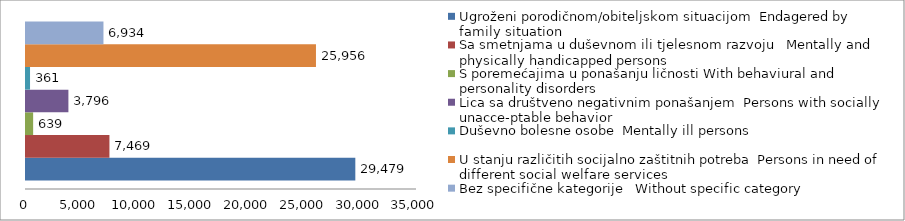
| Category | Ugroženi porodičnom/obiteljskom situacijom  Endagered by family situation | Sa smetnjama u duševnom ili tjelesnom razvoju   Mentally and physically handicapped persons | S poremećajima u ponašanju ličnosti With behaviural and personality disorders | Lica sa društveno negativnim ponašanjem  Persons with socially unacce-ptable behavior | Duševno bolesne osobe  Mentally ill persons | U stanju različitih socijalno zaštitnih potreba  Persons in need of different social welfare services | Bez specifične kategorije   Without specific category |
|---|---|---|---|---|---|---|---|
| 0 | 29479 | 7469 | 639 | 3796 | 361 | 25956 | 6934 |